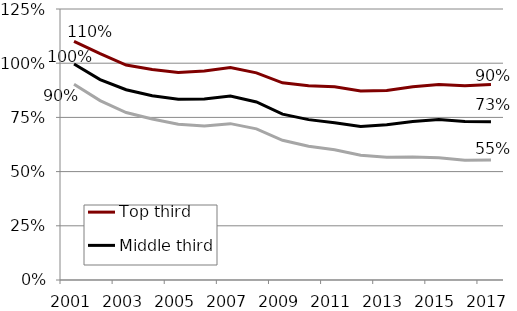
| Category | Top third | Middle third | Bottom third |
|---|---|---|---|
| 2001.0 | 1.1 | 0.996 | 0.903 |
| 2002.0 | 1.044 | 0.925 | 0.827 |
| 2003.0 | 0.992 | 0.877 | 0.772 |
| 2004.0 | 0.971 | 0.85 | 0.743 |
| 2005.0 | 0.957 | 0.833 | 0.719 |
| 2006.0 | 0.964 | 0.835 | 0.711 |
| 2007.0 | 0.98 | 0.848 | 0.721 |
| 2008.0 | 0.955 | 0.821 | 0.697 |
| 2009.0 | 0.909 | 0.765 | 0.645 |
| 2010.0 | 0.896 | 0.74 | 0.617 |
| 2011.0 | 0.891 | 0.725 | 0.601 |
| 2012.0 | 0.872 | 0.708 | 0.575 |
| 2013.0 | 0.874 | 0.716 | 0.566 |
| 2014.0 | 0.892 | 0.731 | 0.567 |
| 2015.0 | 0.902 | 0.74 | 0.564 |
| 2016.0 | 0.895 | 0.731 | 0.553 |
| 2017.0 | 0.902 | 0.73 | 0.553 |